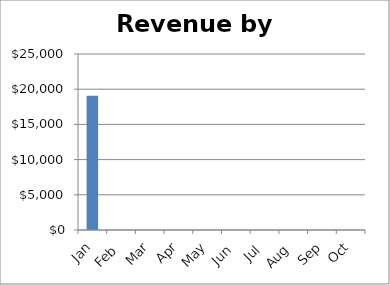
| Category | Series 0 |
|---|---|
| Jan | 19069.41 |
| Feb | 0 |
| Mar | 0 |
| Apr | 0 |
| May | 0 |
| Jun | 0 |
| Jul | 0 |
| Aug | 0 |
| Sep | 0 |
| Oct | 0 |